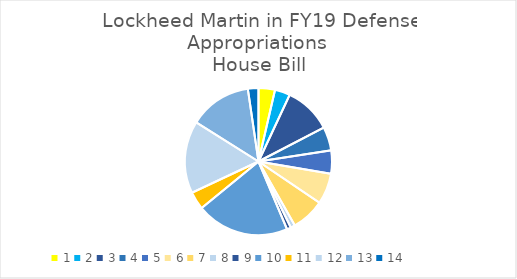
| Category | Series 0 |
|---|---|
| 0 | 168000 |
| 1 | 156000 |
| 2 | 484000 |
| 3 | 242000 |
| 4 | 237200 |
| 5 | 316000 |
| 6 | 340000 |
| 7 | 45500 |
| 8 | 42000 |
| 9 | 950000 |
| 10 | 182500 |
| 11 | 740000 |
| 12 | 640000 |
| 13 | 108000 |